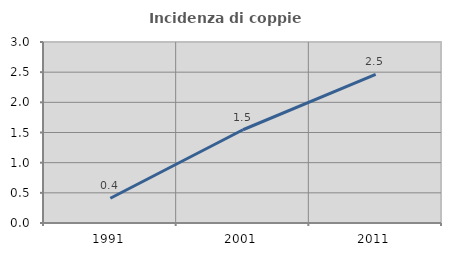
| Category | Incidenza di coppie miste |
|---|---|
| 1991.0 | 0.41 |
| 2001.0 | 1.545 |
| 2011.0 | 2.464 |